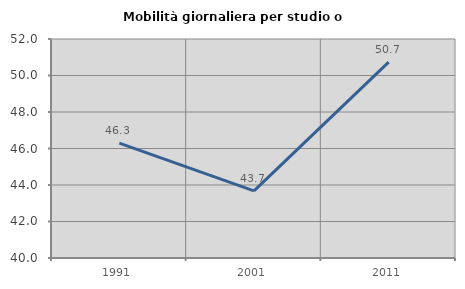
| Category | Mobilità giornaliera per studio o lavoro |
|---|---|
| 1991.0 | 46.293 |
| 2001.0 | 43.675 |
| 2011.0 | 50.729 |